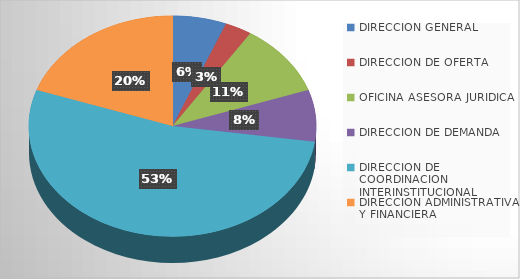
| Category | Series 0 |
|---|---|
| DIRECCION GENERAL | 4 |
| DIRECCION DE OFERTA | 2 |
| OFICINA ASESORA JURIDICA | 7 |
| DIRECCION DE DEMANDA | 5 |
| DIRECCION DE COORDINACION INTERINSTITUCIONAL | 35 |
| DIRECCION ADMINISTRATIVA Y FINANCIERA | 13 |